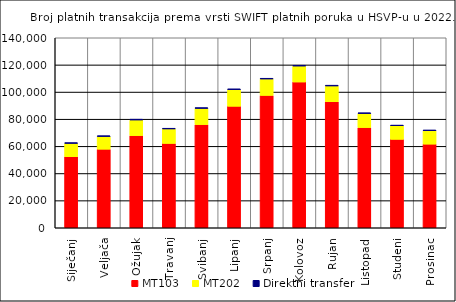
| Category | MT103 | MT202 | Direktni transfer |
|---|---|---|---|
| Siječanj | 52362 | 9829 | 530 |
| Veljača | 57888 | 9384 | 562 |
| Ožujak | 67912 | 11497 | 641 |
| Travanj | 62152 | 10663 | 541 |
| Svibanj | 76040 | 11916 | 580 |
| Lipanj | 89516 | 12277 | 550 |
| Srpanj | 97522 | 12100 | 569 |
| Kolovoz | 107416 | 11755 | 580 |
| Rujan | 92830 | 11656 | 590 |
| Listopad | 73845 | 10336 | 568 |
| Studeni | 65158 | 9991 | 530 |
| Prosinac | 61620 | 9871 | 592 |